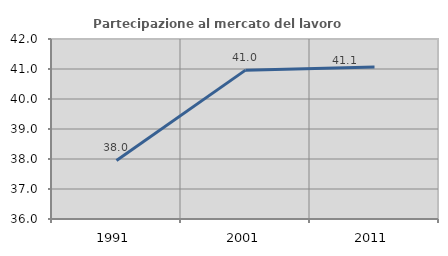
| Category | Partecipazione al mercato del lavoro  femminile |
|---|---|
| 1991.0 | 37.952 |
| 2001.0 | 40.962 |
| 2011.0 | 41.063 |